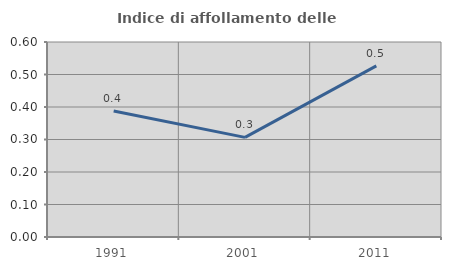
| Category | Indice di affollamento delle abitazioni  |
|---|---|
| 1991.0 | 0.388 |
| 2001.0 | 0.307 |
| 2011.0 | 0.526 |